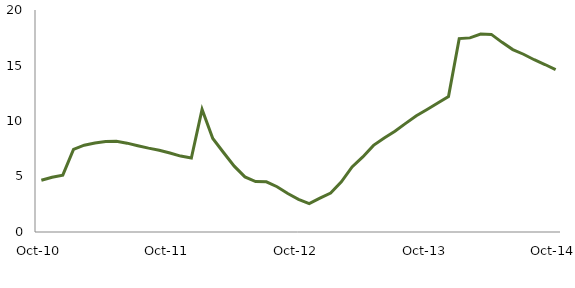
| Category | Series 0 |
|---|---|
| Oct-10 | 4.657 |
|  | 4.929 |
|  | 5.12 |
|  | 7.444 |
|  | 7.818 |
|  | 8.012 |
|  | 8.161 |
|  | 8.168 |
|  | 8.004 |
|  | 7.769 |
|  | 7.555 |
|  | 7.367 |
| Oct-11 | 7.122 |
|  | 6.84 |
|  | 6.661 |
|  | 11.044 |
|  | 8.43 |
|  | 7.165 |
|  | 5.933 |
|  | 4.965 |
|  | 4.549 |
|  | 4.519 |
|  | 4.08 |
|  | 3.461 |
| Oct-12 | 2.94 |
|  | 2.557 |
|  | 3.045 |
|  | 3.508 |
|  | 4.519 |
|  | 5.862 |
|  | 6.765 |
|  | 7.803 |
|  | 8.471 |
|  | 9.075 |
|  | 9.787 |
|  | 10.468 |
| Oct-13 | 11.036 |
|  | 11.622 |
|  | 12.2 |
|  | 17.421 |
|  | 17.488 |
|  | 17.829 |
|  | 17.803 |
|  | 17.087 |
|  | 16.432 |
|  | 16.015 |
|  | 15.52 |
|  | 15.089 |
| Oct-14 | 14.63 |